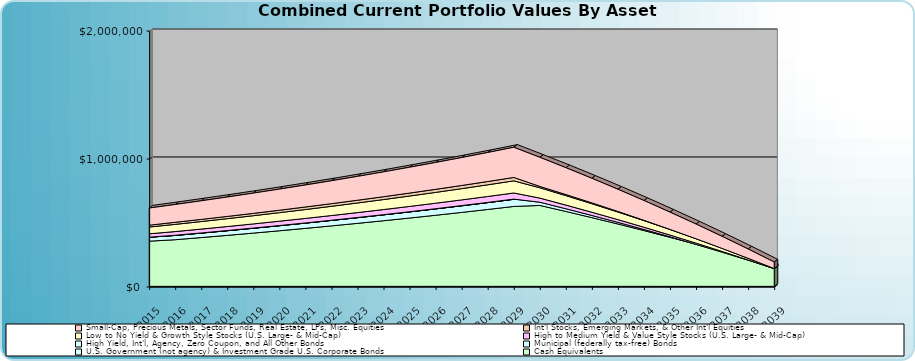
| Category | Cash Equivalents | U.S. Government (not agency) & Investment Grade U.S. Corporate Bonds | Municipal (federally tax-free) Bonds | High Yield, Int'l, Agency, Zero Coupon, and All Other Bonds | High to Medium Yield & Value Style Stocks (U.S. Large- & Mid-Cap) | Low to No Yield & Growth Style Stocks (U.S. Large- & Mid-Cap) | Int'l Stocks, Emerging Markets, & Other Int'l Equities | Small-Cap, Precious Metals, Sector Funds, Real Estate, LPs, Misc. Equities |
|---|---|---|---|---|---|---|---|---|
| 2015.0 | 360721.5 | 31096 | 0 | 0 | 26394 | 52858 | 14469 | 133875 |
| 2016.0 | 372185.996 | 33346.933 | 0 | 1404.5 | 28808.678 | 56280.708 | 16279.677 | 139024.416 |
| 2017.0 | 388900.367 | 34787.796 | 0 | 1404.5 | 30043.206 | 58752.823 | 16950.111 | 145227.64 |
| 2018.0 | 406104.56 | 36270.883 | 0 | 1404.5 | 31313.913 | 61297.385 | 17640.194 | 151612.653 |
| 2019.0 | 423812.929 | 37797.433 | 0 | 1404.5 | 32621.859 | 63916.516 | 18350.499 | 158184.781 |
| 2020.0 | 442040.248 | 39368.719 | 0 | 1404.5 | 33968.134 | 66612.402 | 19081.62 | 164949.507 |
| 2021.0 | 460801.726 | 40986.053 | 0 | 1404.5 | 35353.862 | 69387.291 | 19834.167 | 171912.477 |
| 2022.0 | 480113.016 | 42650.783 | 0 | 1404.5 | 36780.2 | 72243.5 | 20608.767 | 179079.499 |
| 2023.0 | 499990.231 | 44364.298 | 0 | 1404.5 | 38248.337 | 75183.412 | 21406.068 | 186456.554 |
| 2024.0 | 520449.957 | 46128.029 | 0 | 1404.5 | 39759.499 | 78209.478 | 22226.733 | 194049.796 |
| 2025.0 | 541509.262 | 47943.447 | 0 | 1404.5 | 41314.946 | 81324.225 | 23071.449 | 201865.561 |
| 2026.0 | 563185.718 | 49812.066 | 0 | 1404.5 | 42915.975 | 84530.25 | 23940.919 | 209910.37 |
| 2027.0 | 585497.412 | 51735.446 | 0 | 1404.5 | 44563.924 | 87830.229 | 24835.87 | 218190.936 |
| 2028.0 | 608462.959 | 53715.191 | 0 | 1404.5 | 46260.166 | 91226.916 | 25757.047 | 226714.166 |
| 2029.0 | 632101.52 | 55752.953 | 0 | 1404.5 | 48006.117 | 94723.144 | 26705.22 | 235487.174 |
| 2030.0 | 639944.568 | 40872.433 | 0 | -15900 | 32335.485 | 80690.83 | 10376.68 | 227376.028 |
| 2031.0 | 592955.216 | 36821.715 | 0 | -15900 | 28864.837 | 73740.936 | 8491.877 | 209936.813 |
| 2032.0 | 544588.823 | 32652.29 | 0 | -15900 | 25292.48 | 66587.374 | 6551.839 | 191986.536 |
| 2033.0 | 494805.033 | 28360.678 | 0 | -15900 | 21615.434 | 59224.173 | 4554.948 | 173510.219 |
| 2034.0 | 443562.31 | 23943.299 | 0 | -15900 | 17830.631 | 51645.191 | 2499.537 | 154492.446 |
| 2035.0 | 390817.898 | 19396.466 | 0 | -15900 | 13934.913 | 43844.104 | 383.891 | 134917.35 |
| 2036.0 | 336527.791 | 14716.387 | 0 | -15900 | 9925.029 | 35814.403 | -1793.755 | 114768.598 |
| 2037.0 | 280646.691 | 9899.156 | 0 | -15900 | 5797.634 | 27549.389 | -4035.217 | 94029.378 |
| 2038.0 | 223127.973 | 4940.755 | 0 | -15900 | 1549.284 | 19042.164 | -6342.366 | 72682.388 |
| 2039.0 | 163923.646 | -162.955 | 0 | -15900 | -2823.566 | 10285.633 | -8717.127 | 50709.816 |